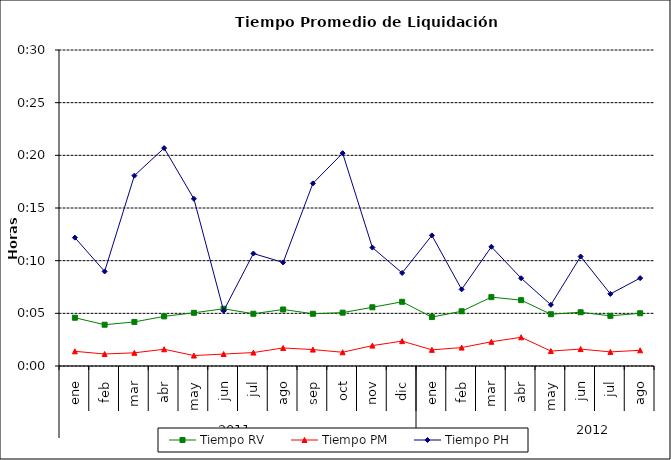
| Category | Tiempo RV | Tiempo PM | Tiempo PH |
|---|---|---|---|
| 0 | 0.003 | 0.001 | 0.009 |
| 1 | 0.003 | 0.001 | 0.006 |
| 2 | 0.003 | 0.001 | 0.013 |
| 3 | 0.003 | 0.001 | 0.014 |
| 4 | 0.004 | 0.001 | 0.011 |
| 5 | 0.004 | 0.001 | 0.004 |
| 6 | 0.003 | 0.001 | 0.007 |
| 7 | 0.004 | 0.001 | 0.007 |
| 8 | 0.003 | 0.001 | 0.012 |
| 9 | 0.004 | 0.001 | 0.014 |
| 10 | 0.004 | 0.001 | 0.008 |
| 11 | 0.004 | 0.002 | 0.006 |
| 12 | 0.003 | 0.001 | 0.009 |
| 13 | 0.004 | 0.001 | 0.005 |
| 14 | 0.005 | 0.002 | 0.008 |
| 15 | 0.004 | 0.002 | 0.006 |
| 16 | 0.003 | 0.001 | 0.004 |
| 17 | 0.004 | 0.001 | 0.007 |
| 18 | 0.003 | 0.001 | 0.005 |
| 19 | 0.004 | 0.001 | 0.006 |